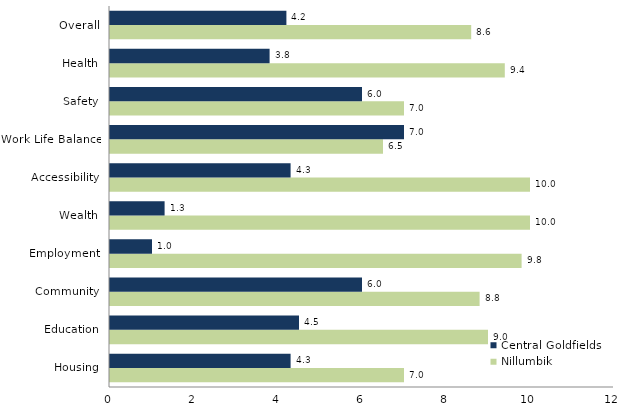
| Category | Nillumbik  | Central Goldfields  |
|---|---|---|
| Housing | 7 | 4.3 |
| Education | 9 | 4.5 |
| Community | 8.8 | 6 |
| Employment | 9.8 | 1 |
| Wealth | 10 | 1.3 |
| Accessibility | 10 | 4.3 |
| Work Life Balance | 6.5 | 7 |
| Safety | 7 | 6 |
| Health | 9.4 | 3.8 |
| Overall | 8.6 | 4.2 |